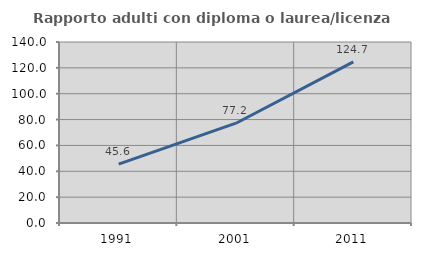
| Category | Rapporto adulti con diploma o laurea/licenza media  |
|---|---|
| 1991.0 | 45.6 |
| 2001.0 | 77.187 |
| 2011.0 | 124.656 |